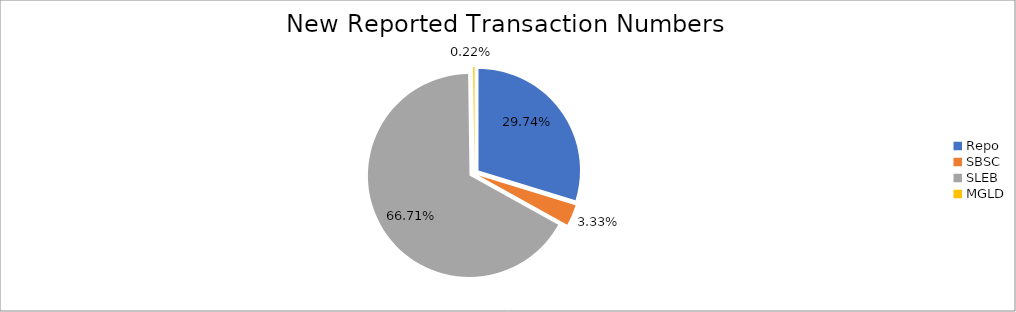
| Category | Series 0 |
|---|---|
| Repo | 404017 |
| SBSC | 45171 |
| SLEB | 906152 |
| MGLD | 2932 |